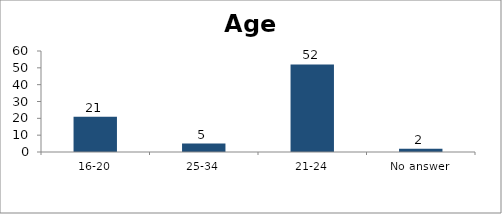
| Category | Age |
|---|---|
| 16-20 | 21 |
| 25-34 | 5 |
| 21-24 | 52 |
| No answer | 2 |